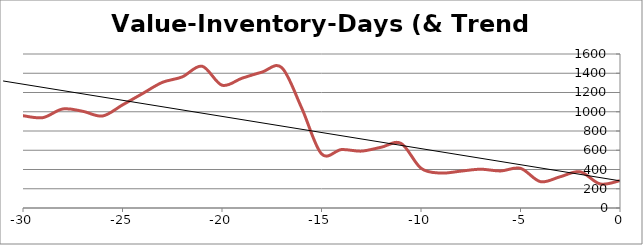
| Category | Series 1 |
|---|---|
| -31.0 | 882 |
| -30.0 | 959 |
| -29.0 | 939 |
| -28.0 | 1029 |
| -27.0 | 1005 |
| -26.0 | 956 |
| -25.0 | 1071 |
| -24.0 | 1188 |
| -23.0 | 1305 |
| -22.0 | 1362 |
| -21.0 | 1473 |
| -20.0 | 1276 |
| -19.0 | 1348 |
| -18.0 | 1411 |
| -17.0 | 1459 |
| -16.0 | 1041 |
| -15.0 | 563 |
| -14.0 | 607 |
| -13.0 | 591 |
| -12.0 | 631 |
| -11.0 | 671 |
| -10.0 | 413 |
| -9.0 | 363 |
| -8.0 | 383 |
| -7.0 | 403 |
| -6.0 | 385 |
| -5.0 | 412 |
| -4.0 | 274 |
| -3.0 | 325 |
| -2.0 | 376 |
| -1.0 | 250 |
| 0.0 | 284 |